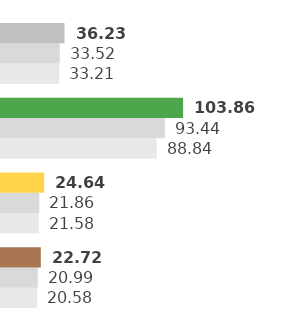
| Category | 2018 | 2019 | 2020 |
|---|---|---|---|
| Colza | 20.582 | 20.987 | 22.722 |
| Tournesol | 21.58 | 21.863 | 24.641 |
| Huile d'olive | 88.836 | 93.436 | 103.857 |
| Autres | 33.211 | 33.52 | 36.225 |